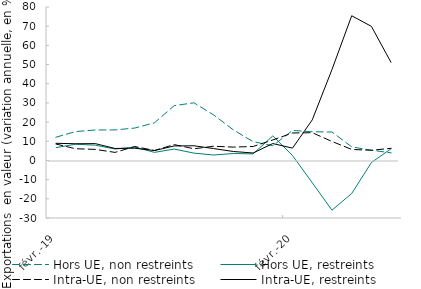
| Category | Hors UE, non restreints | Hors UE, restreints | Intra-UE, non restreints | Intra-UE, restreints |
|---|---|---|---|---|
| 2019-02-01 | 12.104 | 6.668 | 8.581 | 8.941 |
| 2019-03-01 | 15.07 | 8.463 | 6.111 | 8.716 |
| 2019-04-01 | 15.888 | 7.97 | 5.773 | 8.774 |
| 2019-05-01 | 15.906 | 5.972 | 4.202 | 6.245 |
| 2019-06-01 | 16.894 | 6.948 | 7.274 | 6.379 |
| 2019-07-01 | 19.635 | 4.217 | 5.2 | 5.165 |
| 2019-08-01 | 28.574 | 5.936 | 8.265 | 7.565 |
| 2019-09-01 | 30.06 | 3.823 | 6.086 | 7.654 |
| 2019-10-01 | 23.716 | 2.841 | 7.41 | 6.195 |
| 2019-11-01 | 15.945 | 3.632 | 6.959 | 4.671 |
| 2019-12-01 | 9.797 | 3.42 | 7.281 | 3.881 |
| 2020-01-01 | 7.69 | 12.804 | 10.679 | 8.821 |
| 2020-02-01 | 15.645 | 2.543 | 14.326 | 6.427 |
| 2020-03-01 | 14.969 | -11.618 | 14.467 | 21.154 |
| 2020-04-01 | 14.837 | -25.914 | 9.917 | 47.396 |
| 2020-05-01 | 7.102 | -17.231 | 5.736 | 75.436 |
| 2020-06-01 | 5.33 | -1.072 | 5.317 | 69.902 |
| 2020-07-01 | 3.98 | 6.12 | 6.338 | 51.022 |